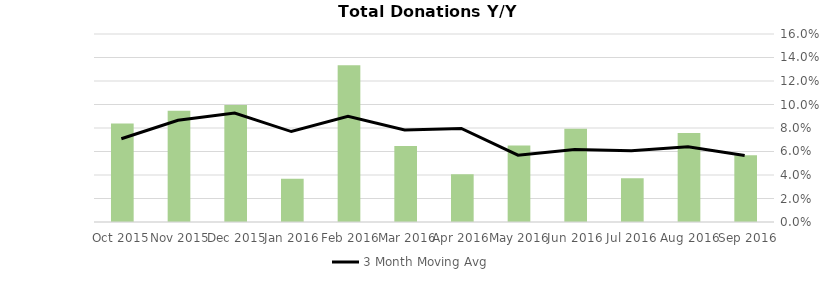
| Category | Donation Index Amount Y/Y Growth |
|---|---|
| Sep 2016 | 0.057 |
| Aug 2016 | 0.076 |
| Jul 2016 | 0.037 |
| Jun 2016 | 0.079 |
| May 2016 | 0.065 |
| Apr 2016 | 0.041 |
| Mar 2016 | 0.065 |
| Feb 2016 | 0.133 |
| Jan 2016 | 0.037 |
| Dec 2015 | 0.1 |
| Nov 2015 | 0.095 |
| Oct 2015 | 0.084 |